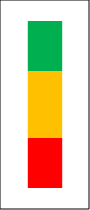
| Category | Series 0 | Series 1 | Series 2 |
|---|---|---|---|
| Summe 1 -10 | 0.3 | 0.4 | 0.3 |